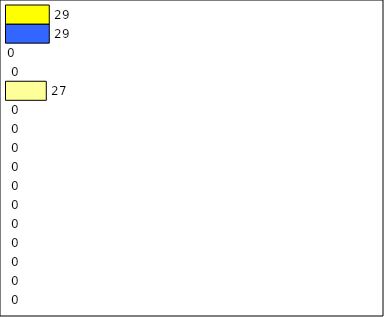
| Category | -2 | -1 | 0 | 1 | 2 | 3 | 4 | 5 | 6 | 7 | 8 | 9 | 10 | 11 | 12 | Perfect Round |
|---|---|---|---|---|---|---|---|---|---|---|---|---|---|---|---|---|
| 0 | 0 | 0 | 0 | 0 | 0 | 0 | 0 | 0 | 0 | 0 | 0 | 27 | 0 | 0 | 29 | 29 |